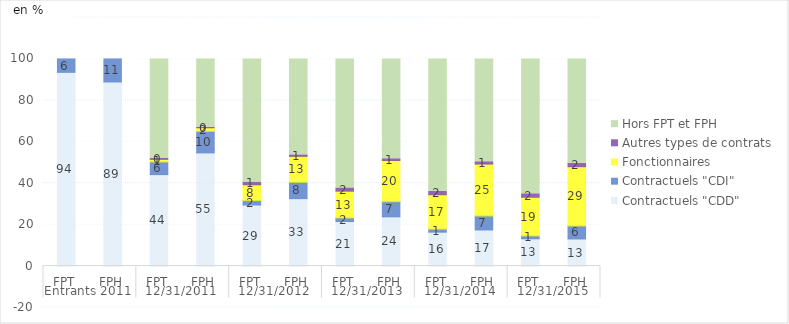
| Category | Contractuels "CDD" | Contractuels "CDI" | Fonctionnaires | Autres types de contrats | Hors FPT et FPH |
|---|---|---|---|---|---|
| 0 | 93.534 | 6.466 | 0 | 0 | 0 |
| 1 | 88.87 | 11.13 | 0 | 0 | 0 |
| 2 | 44.161 | 6.078 | 1.283 | 0.449 | 48.029 |
| 3 | 54.646 | 10.373 | 1.749 | 0.255 | 32.977 |
| 4 | 29.474 | 2.124 | 7.65 | 1.253 | 59.5 |
| 5 | 32.559 | 7.865 | 12.545 | 0.718 | 46.314 |
| 6 | 21.499 | 1.726 | 12.928 | 1.589 | 62.258 |
| 7 | 23.758 | 7.344 | 19.863 | 0.849 | 48.186 |
| 8 | 16.363 | 1.431 | 16.651 | 1.667 | 63.887 |
| 9 | 17.433 | 6.791 | 25.008 | 1.144 | 49.623 |
| 10 | 13.177 | 1.365 | 18.687 | 1.678 | 65.093 |
| 11 | 13.091 | 6.26 | 28.618 | 1.668 | 50.362 |